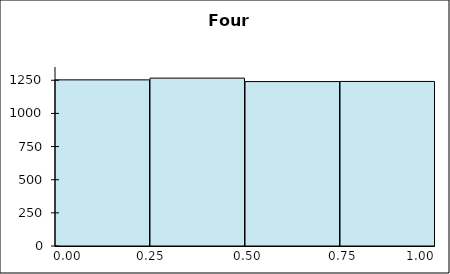
| Category | Series 1 |
|---|---|
| 0 | 1253 |
| 1 | 1266 |
| 2 | 1240 |
| 3 | 1241 |